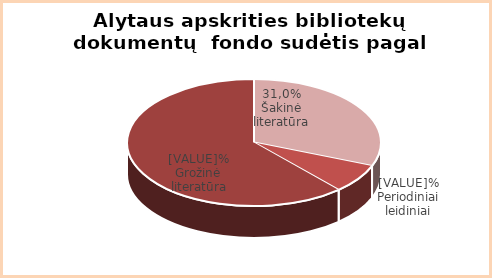
| Category | Series 0 |
|---|---|
| šakinė | 31 |
| Periodika | 7.4 |
| Grožinė | 61.6 |